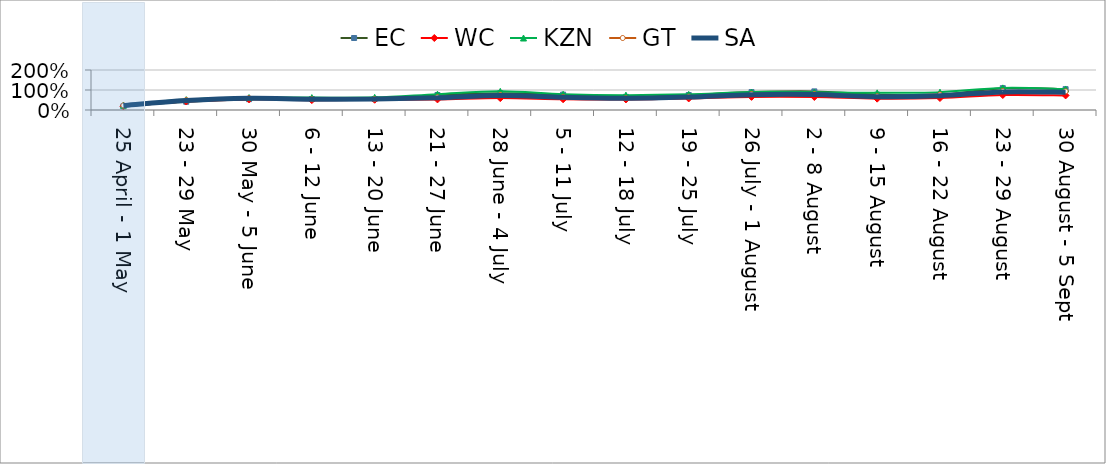
| Category | EC | WC | KZN | GT | SA |
|---|---|---|---|---|---|
| 25 April - 1 May | 0.186 | 0.186 | 0.243 | 0.23 | 0.223 |
| 23 - 29 May | 0.411 | 0.424 | 0.52 | 0.499 | 0.473 |
| 30 May - 5 June | 0.54 | 0.53 | 0.623 | 0.597 | 0.586 |
| 6 - 12 June | 0.549 | 0.493 | 0.621 | 0.543 | 0.541 |
| 13 - 20 June | 0.551 | 0.513 | 0.631 | 0.547 | 0.549 |
| 21 - 27 June | 0.75 | 0.529 | 0.793 | 0.639 | 0.611 |
| 28 June - 4 July | 0.839 | 0.594 | 0.933 | 0.759 | 0.724 |
| 5 - 11 July | 0.769 | 0.537 | 0.789 | 0.654 | 0.637 |
| 12 - 18 July | 0.657 | 0.527 | 0.741 | 0.594 | 0.587 |
| 19 - 25 July | 0.75 | 0.577 | 0.783 | 0.663 | 0.647 |
| 26 July - 1 August | 0.894 | 0.656 | 0.9 | 0.799 | 0.763 |
| 2 - 8 August | 0.93 | 0.651 | 0.891 | 0.8 | 0.771 |
| 9 - 15 August | 0.769 | 0.567 | 0.859 | 0.691 | 0.664 |
| 16 - 22 August | 0.75 | 0.6 | 0.892 | 0.775 | 0.715 |
| 23 - 29 August | 1.091 | 0.749 | 1.106 | 0.95 | 0.906 |
| 30 August - 5 Sept | 1.041 | 0.729 | 1.051 | 0.933 | 0.887 |